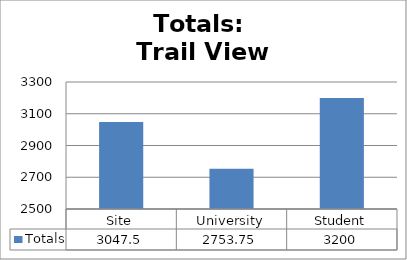
| Category | Totals |
|---|---|
| Site | 3047.5 |
| University | 2753.75 |
| Student | 3200 |